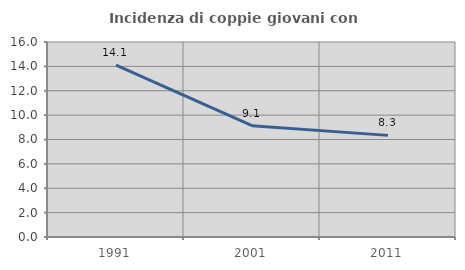
| Category | Incidenza di coppie giovani con figli |
|---|---|
| 1991.0 | 14.102 |
| 2001.0 | 9.137 |
| 2011.0 | 8.339 |